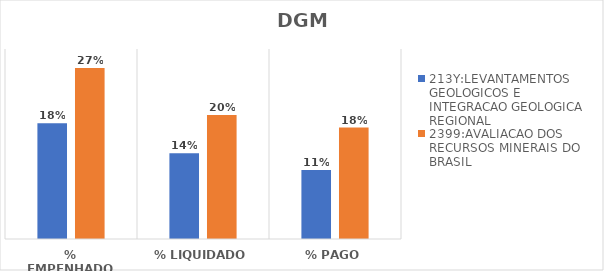
| Category | 213Y:LEVANTAMENTOS GEOLOGICOS E INTEGRACAO GEOLOGICA REGIONAL | 2399:AVALIACAO DOS RECURSOS MINERAIS DO BRASIL |
|---|---|---|
| % EMPENHADO | 0.183 | 0.27 |
| % LIQUIDADO | 0.135 | 0.196 |
| % PAGO | 0.109 | 0.176 |